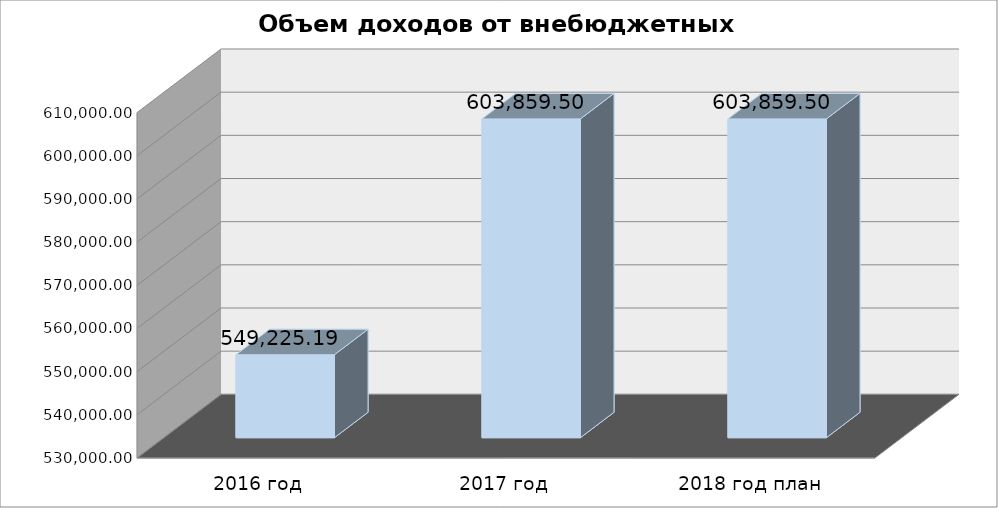
| Category | Series 0 |
|---|---|
| 2016 год | 549225.19 |
| 2017 год | 603859.5 |
| 2018 год план | 603859.5 |